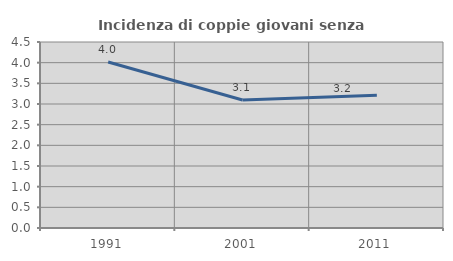
| Category | Incidenza di coppie giovani senza figli |
|---|---|
| 1991.0 | 4.015 |
| 2001.0 | 3.096 |
| 2011.0 | 3.213 |